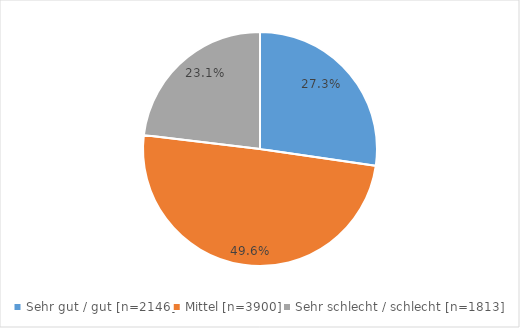
| Category | Series 0 |
|---|---|
| Sehr gut / gut [n=2146] | 0.273 |
| Mittel [n=3900] | 0.496 |
| Sehr schlecht / schlecht [n=1813] | 0.231 |